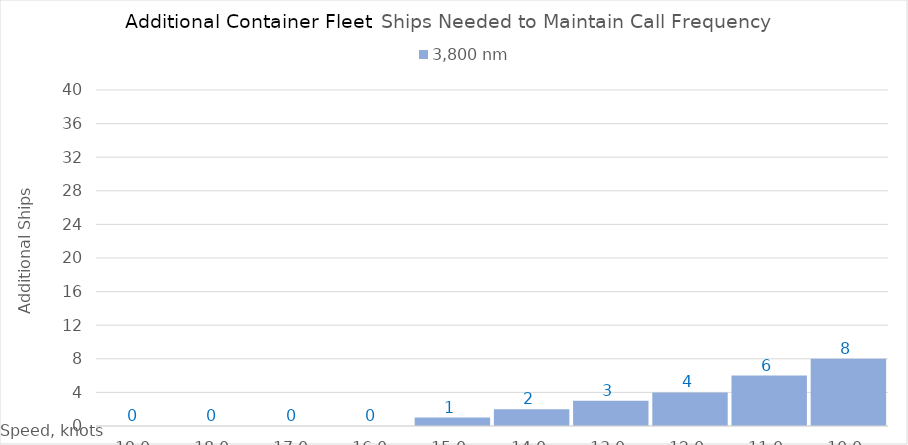
| Category | 3,800 |
|---|---|
| 19.0 | 0 |
| 18.0 | 0 |
| 17.0 | 0 |
| 16.0 | 0 |
| 15.0 | 1 |
| 14.0 | 2 |
| 13.0 | 3 |
| 12.0 | 4 |
| 11.0 | 6 |
| 10.0 | 8 |